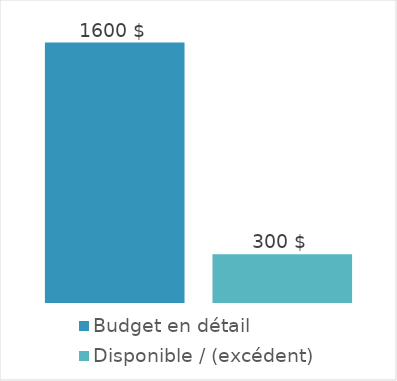
| Category | Budget en détail | Disponible / (excédent) |
|---|---|---|
| 0 | 1600 | 300 |